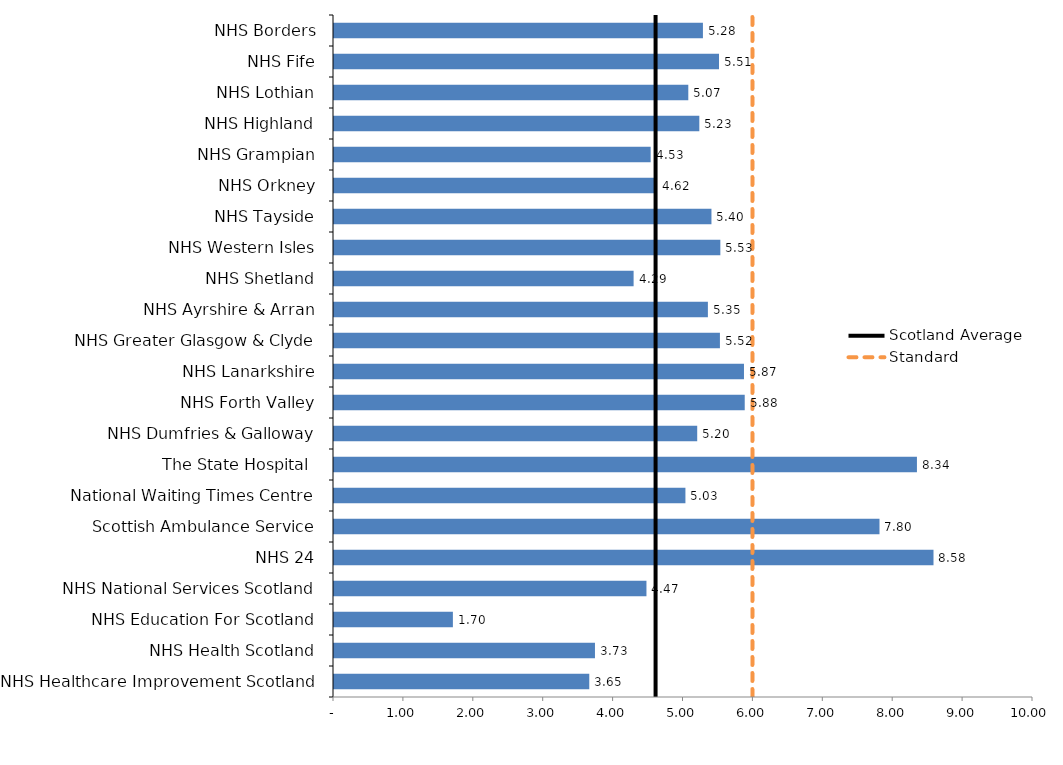
| Category | Boards |
|---|---|
| NHS Borders | 5.278 |
| NHS Fife | 5.508 |
| NHS Lothian | 5.069 |
| NHS Highland | 5.226 |
| NHS Grampian | 4.53 |
| NHS Orkney | 4.617 |
| NHS Tayside | 5.4 |
| NHS Western Isles | 5.527 |
| NHS Shetland | 4.286 |
| NHS Ayrshire & Arran | 5.349 |
| NHS Greater Glasgow & Clyde | 5.521 |
| NHS Lanarkshire | 5.865 |
| NHS Forth Valley | 5.876 |
| NHS Dumfries & Galloway | 5.196 |
| The State Hospital  | 8.34 |
| National Waiting Times Centre | 5.028 |
| Scottish Ambulance Service | 7.804 |
| NHS 24 | 8.576 |
| NHS National Services Scotland | 4.47 |
| NHS Education For Scotland | 1.701 |
| NHS Health Scotland | 3.733 |
| NHS Healthcare Improvement Scotland | 3.652 |